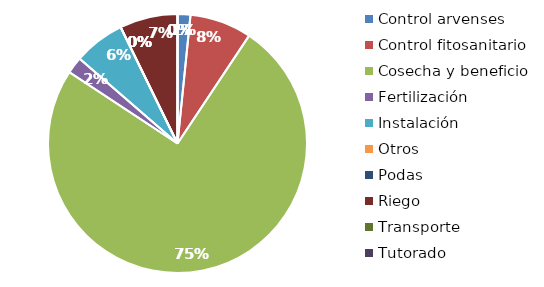
| Category | Valor |
|---|---|
| Control arvenses | 300000 |
| Control fitosanitario | 1440000 |
| Cosecha y beneficio | 13980800 |
| Fertilización | 390000 |
| Instalación | 1194000 |
| Otros | 0 |
| Podas | 0 |
| Riego | 1350000 |
| Transporte | 0 |
| Tutorado | 0 |